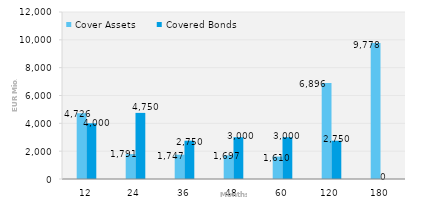
| Category | Cover Assets | Covered Bonds |
|---|---|---|
| 12.0 | 4725.5 | 4000 |
| 24.0 | 1791.321 | 4750 |
| 36.0 | 1746.839 | 2750 |
| 48.0 | 1697.042 | 3000 |
| 60.0 | 1609.626 | 3000 |
| 120.0 | 6895.842 | 2750 |
| 180.0 | 9778.024 | 0 |